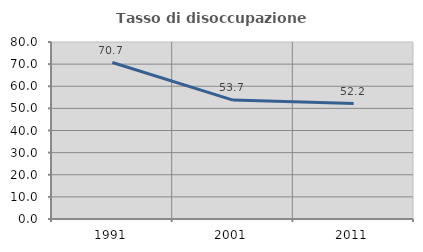
| Category | Tasso di disoccupazione giovanile  |
|---|---|
| 1991.0 | 70.732 |
| 2001.0 | 53.741 |
| 2011.0 | 52.153 |